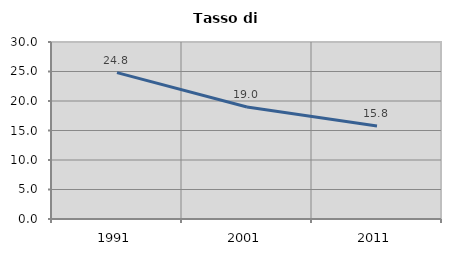
| Category | Tasso di disoccupazione   |
|---|---|
| 1991.0 | 24.808 |
| 2001.0 | 18.973 |
| 2011.0 | 15.772 |